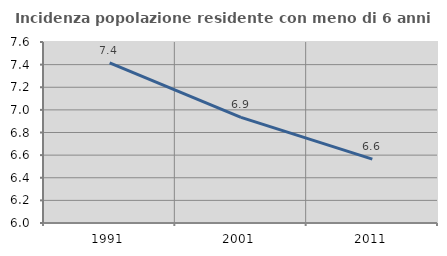
| Category | Incidenza popolazione residente con meno di 6 anni |
|---|---|
| 1991.0 | 7.416 |
| 2001.0 | 6.934 |
| 2011.0 | 6.564 |